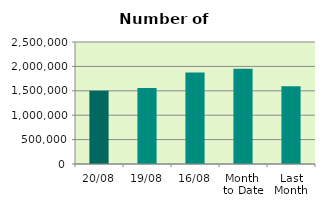
| Category | Series 0 |
|---|---|
| 20/08 | 1499894 |
| 19/08 | 1556908 |
| 16/08 | 1874890 |
| Month 
to Date | 1952735.143 |
| Last
Month | 1591495.826 |